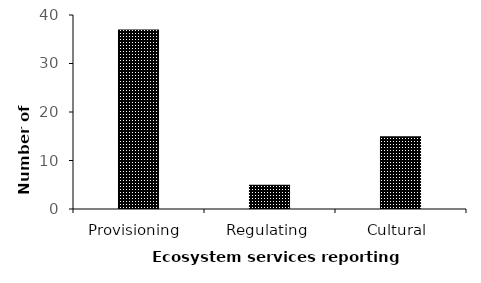
| Category | Series 0 |
|---|---|
| Provisioning | 37 |
| Regulating | 5 |
| Cultural | 15 |